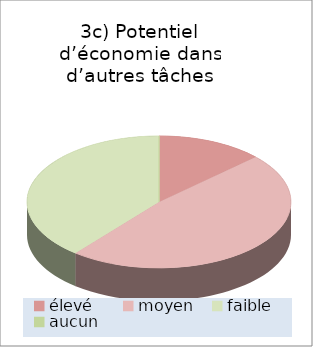
| Category | Autres tâches |
|---|---|
| élevé | 3 |
| moyen | 11 |
| faible | 9 |
| aucun | 0 |